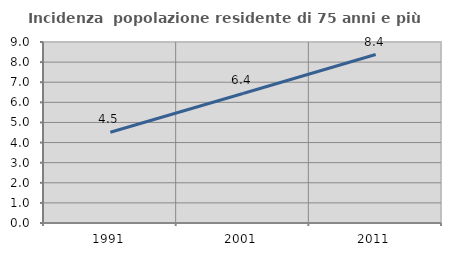
| Category | Incidenza  popolazione residente di 75 anni e più |
|---|---|
| 1991.0 | 4.515 |
| 2001.0 | 6.442 |
| 2011.0 | 8.376 |